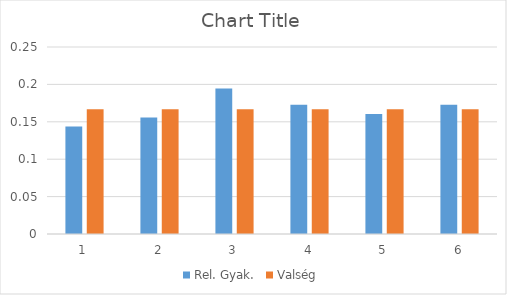
| Category | Rel. Gyak. | Valség |
|---|---|---|
| 0 | 0.144 | 0.167 |
| 1 | 0.156 | 0.167 |
| 2 | 0.195 | 0.167 |
| 3 | 0.173 | 0.167 |
| 4 | 0.161 | 0.167 |
| 5 | 0.173 | 0.167 |